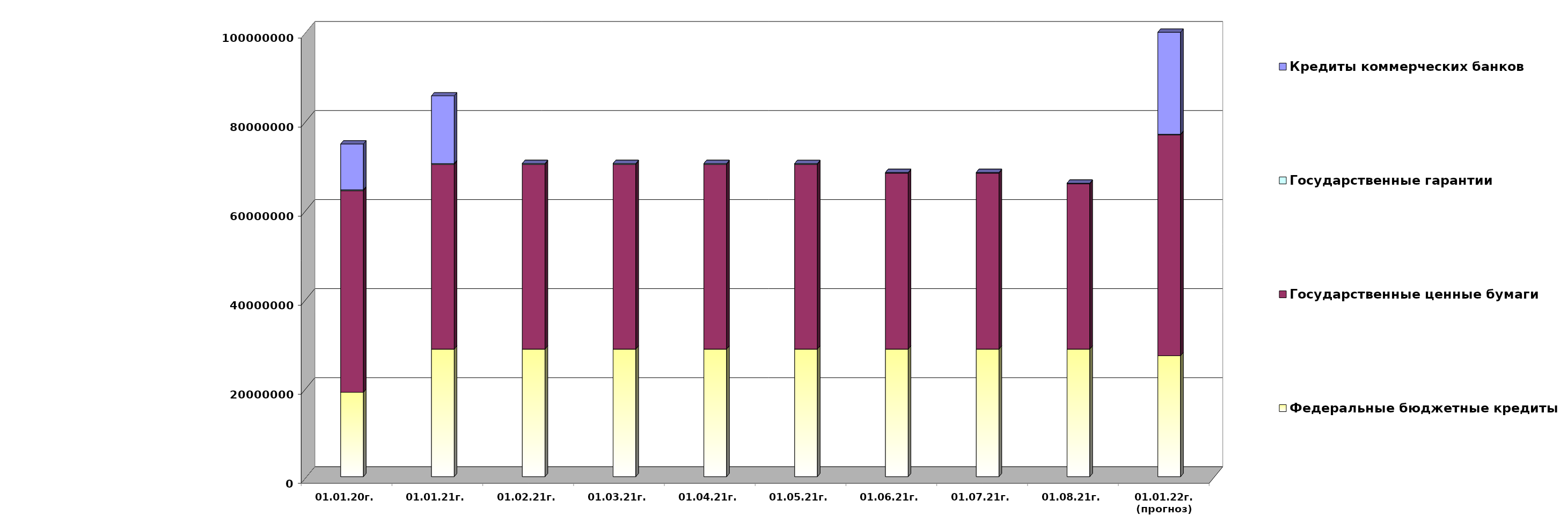
| Category | Федеральные бюджетные кредиты | Государственные ценные бумаги  | Государственные гарантии | Кредиты коммерческих банков |
|---|---|---|---|---|
| 01.01.20г. | 18954967.463 | 45300000 | 186330.02 | 10291177 |
| 01.01.21г. | 28654967.463 | 41500000 | 184738.25 | 15190000 |
| 01.02.21г. | 28654967.463 | 41500000 | 182966.25 | 0 |
| 01.03.21г. | 28654967.463 | 41500000 | 182966.25 | 0 |
| 01.04.21г. | 28654967.463 | 41500000 | 182966.25 | 0 |
| 01.05.21г. | 28654967.463 | 41500000 | 174735.46 | 0 |
| 01.06.21г. | 28654967.463 | 39500000 | 174735.46 | 0 |
| 01.07.21г. | 28654967.463 | 39500000 | 174735.46 | 0 |
| 01.08.21г. | 28654967.463 | 37100000 | 158212.22 | 0 |
| 01.01.22г.
(прогноз) | 27167908.7 | 49600000 | 141570.7 | 22910586.7 |